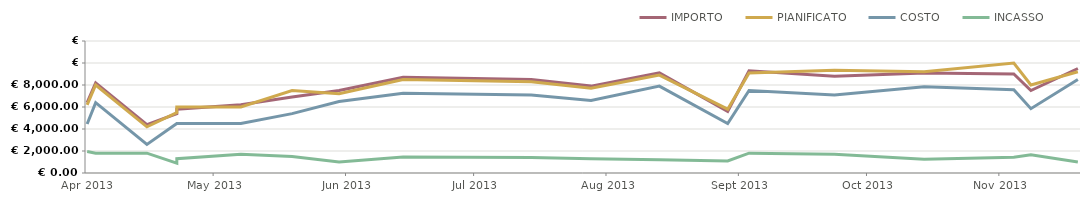
| Category | IMPORTO | PIANIFICATO | COSTO | INCASSO |
|---|---|---|---|---|
| 2013-04-23 | 6400 | 6200 | 4450 | 1950 |
| 2013-04-25 | 8200 | 8000 | 6400 | 1800 |
| 2013-05-07 | 4400 | 4200 | 2600 | 1800 |
| 2013-05-14 | 5400 | 5500 | 4500 | 900 |
| 2013-05-14 | 5800 | 6000 | 4500 | 1300 |
| 2013-05-29 | 6200 | 6000 | 4500 | 1700 |
| 2013-06-10 | 6900 | 7500 | 5400 | 1500 |
| 2013-06-21 | 7500 | 7200 | 6500 | 1000 |
| 2013-07-06 | 8700 | 8500 | 7250 | 1450 |
| 2013-08-05 | 8500 | 8300 | 7100 | 1400 |
| 2013-08-19 | 7900 | 7700 | 6600 | 1300 |
| 2013-09-04 | 9100 | 8900 | 7900 | 1200 |
| 2013-09-20 | 5600 | 5800 | 4500 | 1100 |
| 2013-09-25 | 9300 | 9100 | 7500 | 1800 |
| 2013-10-15 | 8800 | 9350 | 7100 | 1700 |
| 2013-11-05 | 9100 | 9200 | 7850 | 1250 |
| 2013-11-26 | 9000 | 10000 | 7575 | 1425 |
| 2013-11-30 | 7500 | 8000 | 5850 | 1650 |
| 2013-12-11 | 9500 | 9200 | 8500 | 1000 |